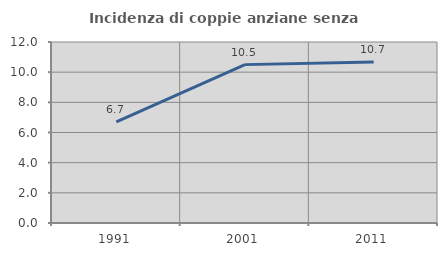
| Category | Incidenza di coppie anziane senza figli  |
|---|---|
| 1991.0 | 6.711 |
| 2001.0 | 10.5 |
| 2011.0 | 10.667 |